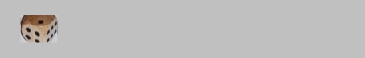
| Category | 1 | 2 | 3 | 4 | 5 | 6 |
|---|---|---|---|---|---|---|
| 2 | 0 | 1 | 0 | 0 | 0 | 0 |